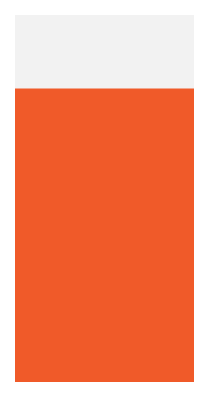
| Category | Series 0 | Series 1 |
|---|---|---|
| 0 | 1 | 0.8 |